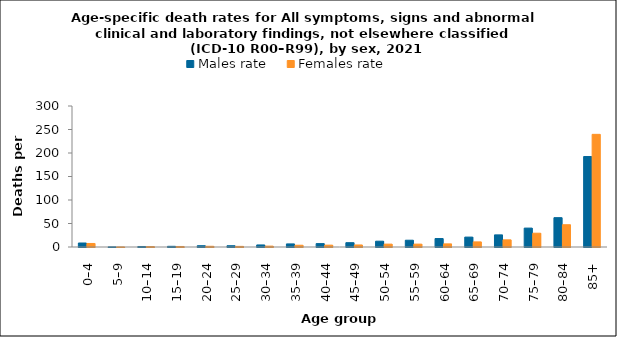
| Category | Males rate | Females rate |
|---|---|---|
| 0–4 | 8.502 | 7.497 |
| 5–9 | 0.241 | 0.127 |
| 10–14 | 1.077 | 0.888 |
| 15–19 | 1.444 | 1.115 |
| 20–24 | 2.748 | 1.526 |
| 25–29 | 2.722 | 1.328 |
| 30–34 | 4.359 | 1.877 |
| 35–39 | 6.572 | 3.727 |
| 40–44 | 7.231 | 3.935 |
| 45–49 | 9.177 | 4.323 |
| 50–54 | 12.34 | 6.117 |
| 55–59 | 14.425 | 6.092 |
| 60–64 | 17.998 | 6.633 |
| 65–69 | 21.051 | 10.866 |
| 70–74 | 25.78 | 15.201 |
| 75–79 | 40.223 | 29.331 |
| 80–84 | 62.409 | 47.386 |
| 85+ | 192.513 | 239.673 |